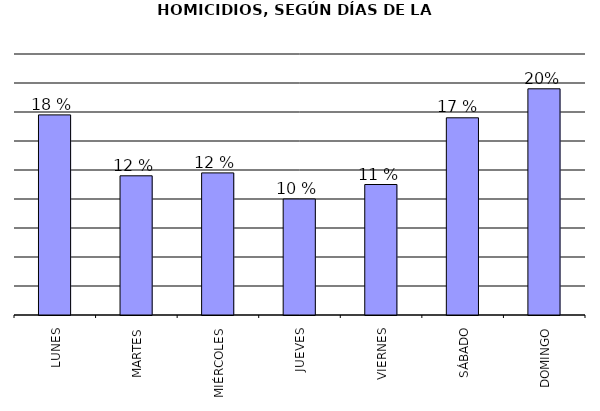
| Category | Series 0 |
|---|---|
| LUNES | 69 |
| MARTES | 48 |
| MIÉRCOLES | 49 |
| JUEVES | 40 |
| VIERNES | 45 |
| SÁBADO | 68 |
| DOMINGO | 78 |